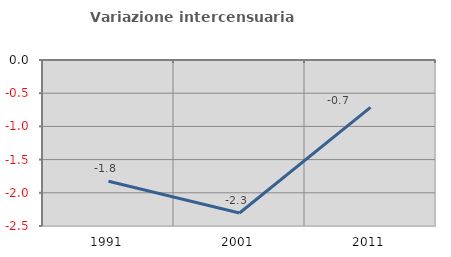
| Category | Variazione intercensuaria annua |
|---|---|
| 1991.0 | -1.825 |
| 2001.0 | -2.304 |
| 2011.0 | -0.715 |